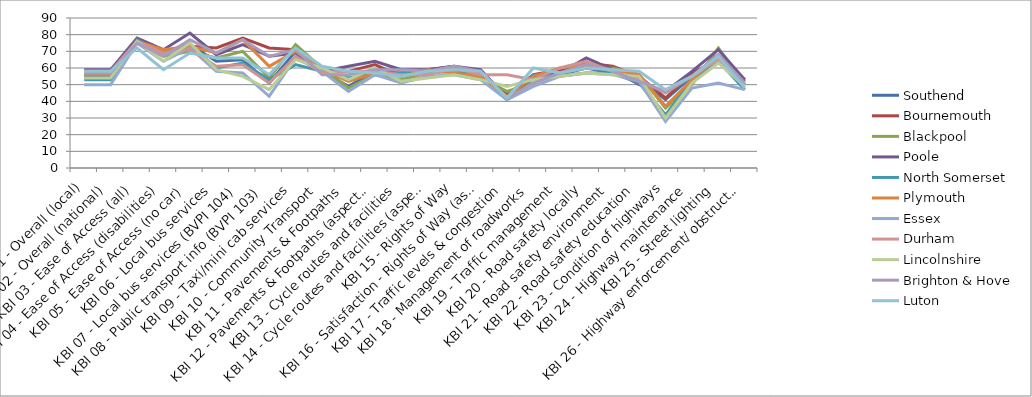
| Category | Southend | Bournemouth | Blackpool | Poole | North Somerset | Plymouth | Essex | Durham | Lincolnshire | Brighton & Hove | Luton |
|---|---|---|---|---|---|---|---|---|---|---|---|
| KBI 01 - Overall (local) | 55 | 58 | 57 | 59 | 53 | 56 | 50 | 58 | 54 | 57 | 58 |
| KBI 02 - Overall (national) | 55 | 58 | 56 | 59 | 53 | 56 | 50 | 58 | 54 | 57 | 58 |
| KBI 03 - Ease of Access (all) | 76 | 77 | 75 | 78 | 77 | 76 | 75 | 76 | 76 | 75 | 72 |
| KBI 04 - Ease of Access (disabilities) | 70 | 69 | 67 | 71 | 69 | 71 | 64 | 69 | 64 | 67 | 59 |
| KBI 05 - Ease of Access (no car) | 74 | 73 | 70 | 81 | 74 | 73 | 72 | 71 | 75 | 77 | 69 |
| KBI 06 - Local bus services | 64 | 72 | 66 | 68 | 60 | 69 | 58 | 61 | 59 | 69 | 66 |
| KBI 07 - Local bus services (BVPI 104) | 65 | 78 | 70 | 74 | 63 | 77 | 57 | 62 | 55 | 77 | 66 |
| KBI 08 - Public transport info (BVPI 103) | 51 | 72 | 54 | 67 | 53 | 61 | 43 | 51 | 47 | 67 | 56 |
| KBI 09 - Taxi/mini cab services | 70 | 71 | 74 | 69 | 62 | 70 | 66 | 67 | 65 | 71 | 72 |
| KBI 10 - Community Transport | 58 | 57 | 60 | 58 | 58 | 59 | 58 | 57 | 60 | 56 | 61 |
| KBI 11 - Pavements & Footpaths | 49 | 58 | 48 | 61 | 54 | 52 | 46 | 58 | 53 | 56 | 58 |
| KBI 12 - Pavements & Footpaths (aspects) | 58 | 62 | 56 | 64 | 57 | 57 | 56 | 58 | 60 | 59 | 57 |
| KBI 13 - Cycle routes and facilities | 57 | 55 | 53 | 59 | 57 | 55 | 51 | 56 | 52 | 59 | 55 |
| KBI 14 - Cycle routes and facilities (aspects) | 58 | 59 | 57 | 59 | 58 | 59 | 55 | 56 | 54 | 58 | 58 |
| KBI 15 - Rights of Way | 58 | 61 | 58 | 61 | 58 | 57 | 56 | 60 | 56 | 61 | 59 |
| KBI 16 - Satisfaction - Rights of Way (aspects) | 57 | 57 | 54 | 59 | 56 | 55 | 53 | 56 | 53 | 58 | 58 |
| KBI 17 - Traffic levels & congestion | 41 | 44 | 46 | 42 | 42 | 43 | 41 | 56 | 49 | 42 | 42 |
| KBI 18 - Management of roadworks | 54 | 56 | 51 | 55 | 56 | 55 | 49 | 53 | 53 | 51 | 60 |
| KBI 19 - Traffic management | 56 | 59 | 57 | 57 | 55 | 60 | 55 | 60 | 55 | 57 | 57 |
| KBI 20 - Road safety locally | 60 | 63 | 60 | 66 | 57 | 62 | 57 | 64 | 57 | 62 | 60 |
| KBI 21 - Road safety environment | 57 | 61 | 60 | 59 | 57 | 59 | 56 | 58 | 56 | 58 | 59 |
| KBI 22 - Road safety education | 53 | 55 | 56 | 50 | 51 | 56 | 52 | 53 | 55 | 52 | 58 |
| KBI 23 - Condition of highways | 41 | 42 | 36 | 46 | 32 | 37 | 28 | 45 | 30 | 46 | 47 |
| KBI 24 - Highway maintenance | 55 | 57 | 50 | 58 | 52 | 53 | 48 | 55 | 51 | 55 | 55 |
| KBI 25 - Street lighting | 67 | 65 | 72 | 71 | 64 | 67 | 51 | 65 | 63 | 68 | 67 |
| KBI 26 - Highway enforcement/ obstructions | 52 | 53 | 50 | 53 | 47 | 50 | 47 | 50 | 49 | 51 | 48 |